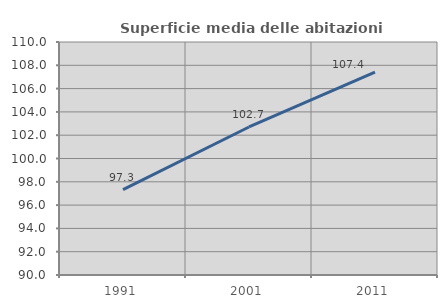
| Category | Superficie media delle abitazioni occupate |
|---|---|
| 1991.0 | 97.329 |
| 2001.0 | 102.705 |
| 2011.0 | 107.412 |